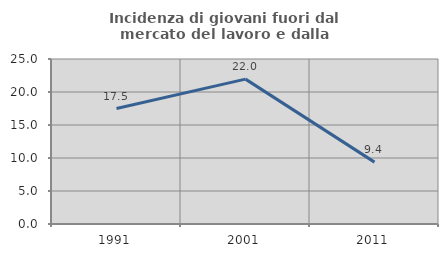
| Category | Incidenza di giovani fuori dal mercato del lavoro e dalla formazione  |
|---|---|
| 1991.0 | 17.5 |
| 2001.0 | 21.951 |
| 2011.0 | 9.375 |